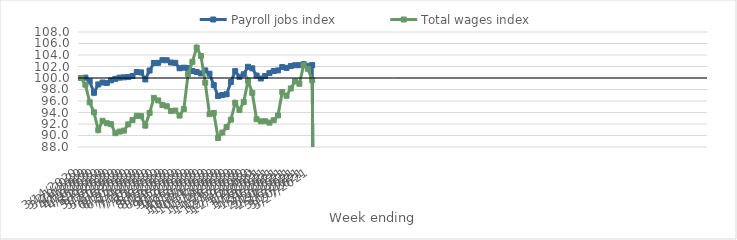
| Category | Payroll jobs index | Total wages index |
|---|---|---|
| 14/03/2020 | 100 | 100 |
| 21/03/2020 | 100.065 | 98.835 |
| 28/03/2020 | 99.426 | 95.776 |
| 04/04/2020 | 97.429 | 94.034 |
| 11/04/2020 | 98.883 | 90.946 |
| 18/04/2020 | 99.216 | 92.554 |
| 25/04/2020 | 99.139 | 92.134 |
| 02/05/2020 | 99.592 | 91.967 |
| 09/05/2020 | 99.86 | 90.404 |
| 16/05/2020 | 100.065 | 90.684 |
| 23/05/2020 | 100.118 | 90.853 |
| 30/05/2020 | 100.161 | 91.933 |
| 06/06/2020 | 100.355 | 92.676 |
| 13/06/2020 | 101.037 | 93.424 |
| 20/06/2020 | 100.976 | 93.37 |
| 27/06/2020 | 99.755 | 91.724 |
| 04/07/2020 | 101.302 | 93.946 |
| 11/07/2020 | 102.606 | 96.542 |
| 18/07/2020 | 102.635 | 96.101 |
| 25/07/2020 | 103.098 | 95.301 |
| 01/08/2020 | 103.09 | 95.09 |
| 08/08/2020 | 102.688 | 94.267 |
| 15/08/2020 | 102.638 | 94.338 |
| 22/08/2020 | 101.69 | 93.466 |
| 29/08/2020 | 101.794 | 94.589 |
| 05/09/2020 | 101.752 | 100.693 |
| 12/09/2020 | 101.215 | 102.81 |
| 19/09/2020 | 101.037 | 105.292 |
| 26/09/2020 | 100.798 | 103.829 |
| 03/10/2020 | 101.316 | 99.183 |
| 10/10/2020 | 100.743 | 93.702 |
| 17/10/2020 | 98.766 | 93.924 |
| 24/10/2020 | 96.871 | 89.575 |
| 31/10/2020 | 97.038 | 90.51 |
| 07/11/2020 | 97.169 | 91.463 |
| 14/11/2020 | 99.296 | 92.756 |
| 21/11/2020 | 101.201 | 95.689 |
| 28/11/2020 | 100.201 | 94.426 |
| 05/12/2020 | 100.649 | 95.818 |
| 12/12/2020 | 101.954 | 99.524 |
| 19/12/2020 | 101.683 | 97.41 |
| 26/12/2020 | 100.423 | 92.833 |
| 02/01/2021 | 99.908 | 92.458 |
| 09/01/2021 | 100.355 | 92.479 |
| 16/01/2021 | 100.848 | 92.237 |
| 23/01/2021 | 101.216 | 92.652 |
| 30/01/2021 | 101.319 | 93.492 |
| 06/02/2021 | 101.903 | 97.56 |
| 13/02/2021 | 101.756 | 96.915 |
| 20/02/2021 | 102.079 | 98.188 |
| 27/02/2021 | 102.217 | 99.422 |
| 06/03/2021 | 102.232 | 99.001 |
| 13/03/2021 | 102.412 | 102.228 |
| 20/03/2021 | 102.116 | 101.59 |
| 27/03/2021 | 102.242 | 99.615 |